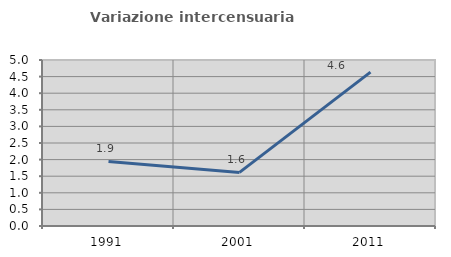
| Category | Variazione intercensuaria annua |
|---|---|
| 1991.0 | 1.944 |
| 2001.0 | 1.614 |
| 2011.0 | 4.634 |